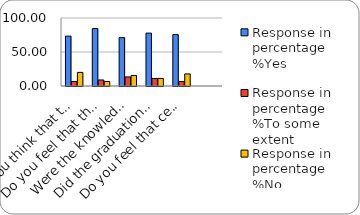
| Category | Response in percentage  |
|---|---|
| Do you think that the curriculum which you had during your graduation/post graduation has provided you with the knowledge & skills necessary to get employed/Self-employed or start own business? | 20 |
| Do you feel that the curriculum you studied is helpful in progression to higher studies? | 6.667 |
| Were the knowledge & skills acquired through the curriculum useful to you while working on the job?   | 15.556 |
| Did the graduation/post-graduation programme bring about any attitudinal and behavioural change in you? | 11.111 |
| Do you feel that certificate/ diploma courses offered by the college in addition to the curriculum lead to better career prospects? | 17.778 |